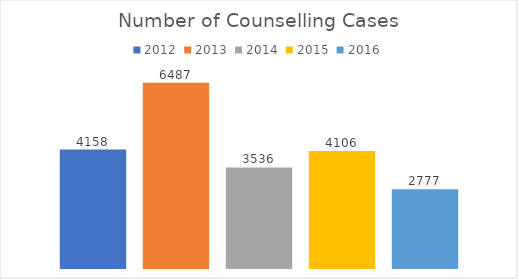
| Category | 2012 | 2013 | 2014 | 2015 | 2016 |
|---|---|---|---|---|---|
| 0 | 4158 | 6487 | 3536 | 4106 | 2777 |